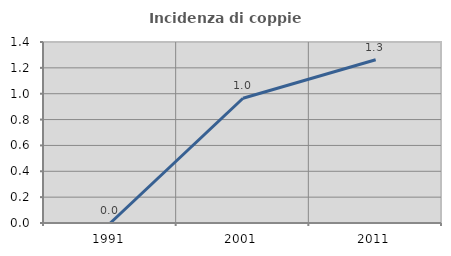
| Category | Incidenza di coppie miste |
|---|---|
| 1991.0 | 0 |
| 2001.0 | 0.965 |
| 2011.0 | 1.263 |